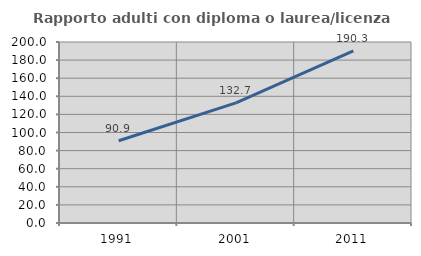
| Category | Rapporto adulti con diploma o laurea/licenza media  |
|---|---|
| 1991.0 | 90.942 |
| 2001.0 | 132.687 |
| 2011.0 | 190.313 |